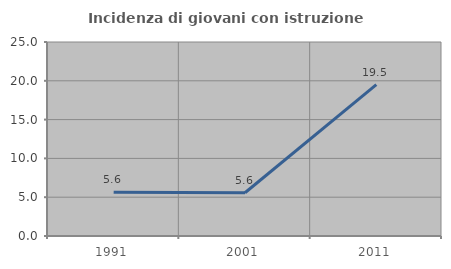
| Category | Incidenza di giovani con istruzione universitaria |
|---|---|
| 1991.0 | 5.634 |
| 2001.0 | 5.578 |
| 2011.0 | 19.512 |